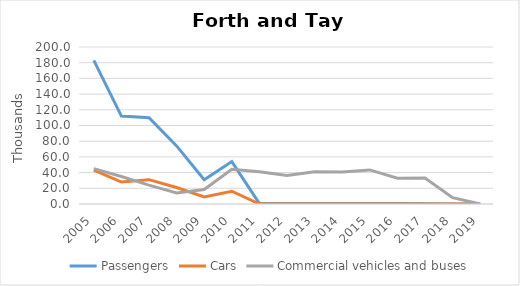
| Category | Passengers | Cars | Commercial vehicles and buses |
|---|---|---|---|
| 2005.0 | 183 | 43 | 45 |
| 2006.0 | 112 | 28 | 35 |
| 2007.0 | 110 | 31 | 24 |
| 2008.0 | 74 | 21 | 14 |
| 2009.0 | 31 | 9 | 18.368 |
| 2010.0 | 54.016 | 16.229 | 44.326 |
| 2011.0 | 0.563 | 0.003 | 41.073 |
| 2012.0 | 0.706 | 0.013 | 36.335 |
| 2013.0 | 0.686 | 0.001 | 41.164 |
| 2014.0 | 0.673 | 0.002 | 40.638 |
| 2015.0 | 0.479 | 0.006 | 43.392 |
| 2016.0 | 0.721 | 0.004 | 32.837 |
| 2017.0 | 0.411 | 0.041 | 33.08 |
| 2018.0 | 0.045 | 0.001 | 7.994 |
| 2019.0 | 0 | 0 | 0 |